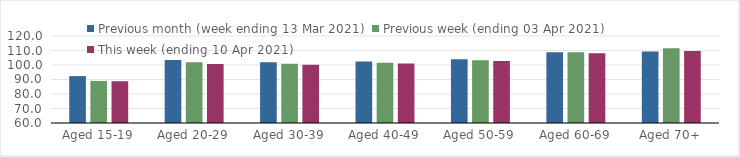
| Category | Previous month (week ending 13 Mar 2021) | Previous week (ending 03 Apr 2021) | This week (ending 10 Apr 2021) |
|---|---|---|---|
| Aged 15-19 | 92.34 | 89.01 | 88.81 |
| Aged 20-29 | 103.39 | 101.9 | 100.73 |
| Aged 30-39 | 101.86 | 100.8 | 100.18 |
| Aged 40-49 | 102.34 | 101.5 | 101.05 |
| Aged 50-59 | 104 | 103.26 | 102.84 |
| Aged 60-69 | 108.74 | 108.79 | 108.06 |
| Aged 70+ | 109.24 | 111.58 | 109.6 |